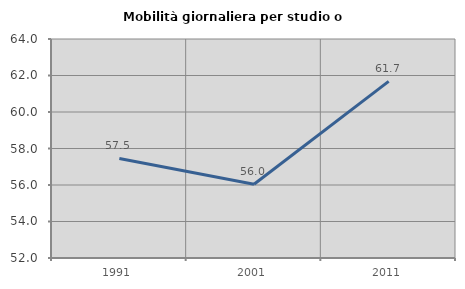
| Category | Mobilità giornaliera per studio o lavoro |
|---|---|
| 1991.0 | 57.456 |
| 2001.0 | 56.042 |
| 2011.0 | 61.68 |